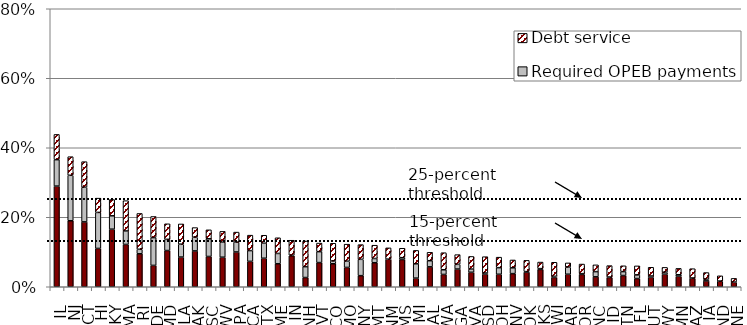
| Category | Required pension payments | Required OPEB payments | Debt service |
|---|---|---|---|
| IL | 0.29 | 0.076 | 0.073 |
| NJ | 0.19 | 0.131 | 0.054 |
| CT | 0.187 | 0.1 | 0.074 |
| HI | 0.11 | 0.104 | 0.041 |
| KY | 0.166 | 0.039 | 0.047 |
| MA | 0.122 | 0.039 | 0.087 |
| RI | 0.095 | 0.013 | 0.103 |
| DE | 0.061 | 0.08 | 0.061 |
| MD | 0.104 | 0.032 | 0.045 |
| LA | 0.085 | 0.037 | 0.058 |
| AK | 0.103 | 0.04 | 0.028 |
| SC | 0.087 | 0.051 | 0.026 |
| WV | 0.085 | 0.043 | 0.031 |
| PA | 0.1 | 0.028 | 0.029 |
| CA | 0.073 | 0.031 | 0.044 |
| TX | 0.082 | 0.043 | 0.023 |
| ME | 0.066 | 0.03 | 0.045 |
| IN | 0.089 | 0.001 | 0.043 |
| NH | 0.027 | 0.031 | 0.074 |
| VT | 0.07 | 0.031 | 0.025 |
| CO | 0.066 | 0.008 | 0.051 |
| MO | 0.056 | 0.018 | 0.049 |
| NY | 0.032 | 0.047 | 0.042 |
| MT | 0.069 | 0.012 | 0.038 |
| NM | 0.079 | 0 | 0.032 |
| MS | 0.078 | 0.005 | 0.027 |
| MI | 0.025 | 0.041 | 0.039 |
| AL | 0.057 | 0.018 | 0.024 |
| WA | 0.035 | 0.013 | 0.049 |
| GA | 0.051 | 0.014 | 0.028 |
| VA | 0.042 | 0.009 | 0.036 |
| SD | 0.036 | 0.003 | 0.047 |
| OH | 0.036 | 0.019 | 0.03 |
| NV | 0.038 | 0.017 | 0.023 |
| OK | 0.042 | 0.001 | 0.032 |
| KS | 0.05 | 0.002 | 0.019 |
| WI | 0.027 | 0.003 | 0.04 |
| AR | 0.036 | 0.021 | 0.012 |
| OR | 0.035 | 0.002 | 0.028 |
| NC | 0.029 | 0.015 | 0.019 |
| ID | 0.027 | 0.001 | 0.033 |
| TN | 0.032 | 0.011 | 0.017 |
| FL | 0.024 | 0.011 | 0.026 |
| UT | 0.028 | 0.003 | 0.025 |
| WY | 0.036 | 0.006 | 0.014 |
| MN | 0.03 | 0.004 | 0.018 |
| AZ | 0.024 | 0.001 | 0.027 |
| IA | 0.017 | 0.005 | 0.019 |
| ND | 0.016 | 0 | 0.015 |
| NE | 0.013 | 0 | 0.011 |